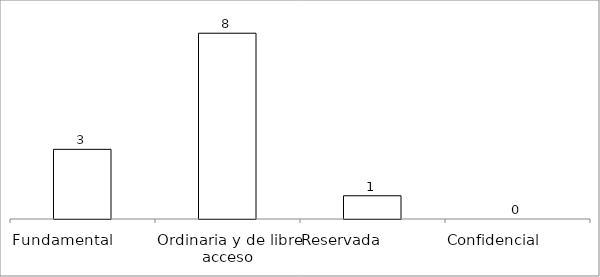
| Category | Series 0 |
|---|---|
| Fundamental         | 3 |
| Ordinaria y de libre acceso | 8 |
| Reservada               | 1 |
| Confidencial             | 0 |